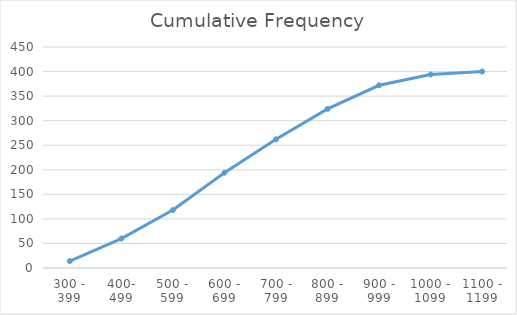
| Category | Cumulative Frequency |
|---|---|
| 300 - 399 | 14 |
| 400- 499 | 60 |
| 500 - 599 | 118 |
| 600 - 699 | 194 |
| 700 - 799 | 262 |
| 800 - 899 | 324 |
| 900 - 999 | 372 |
| 1000 - 1099 | 394 |
| 1100 - 1199 | 400 |